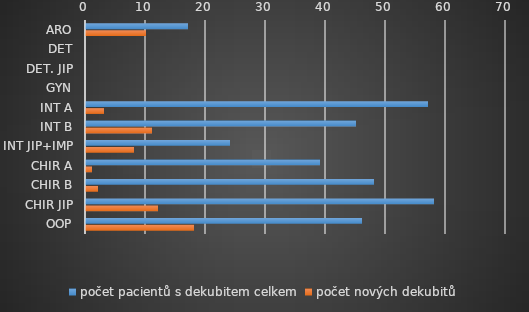
| Category | počet pacientů s dekubitem celkem | počet nových dekubitů |
|---|---|---|
| ARO | 17 | 10 |
| DET | 0 | 0 |
| DET. JIP | 0 | 0 |
| GYN | 0 | 0 |
| INT A | 57 | 3 |
| INT B | 45 | 11 |
| INT JIP+IMP | 24 | 8 |
| CHIR A | 39 | 1 |
| CHIR B | 48 | 2 |
| CHIR JIP | 58 | 12 |
| OOP | 46 | 18 |